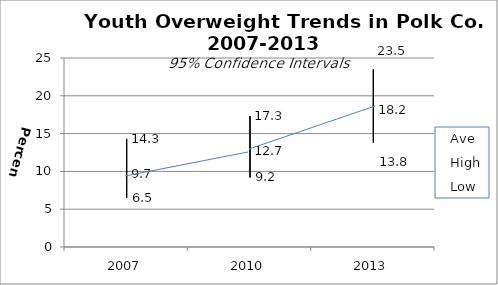
| Category | Ave | High | Low |
|---|---|---|---|
| 2007.0 | 9.7 | 14.3 | 6.5 |
| 2010.0 | 12.7 | 17.3 | 9.2 |
| 2013.0 | 18.2 | 23.5 | 13.8 |